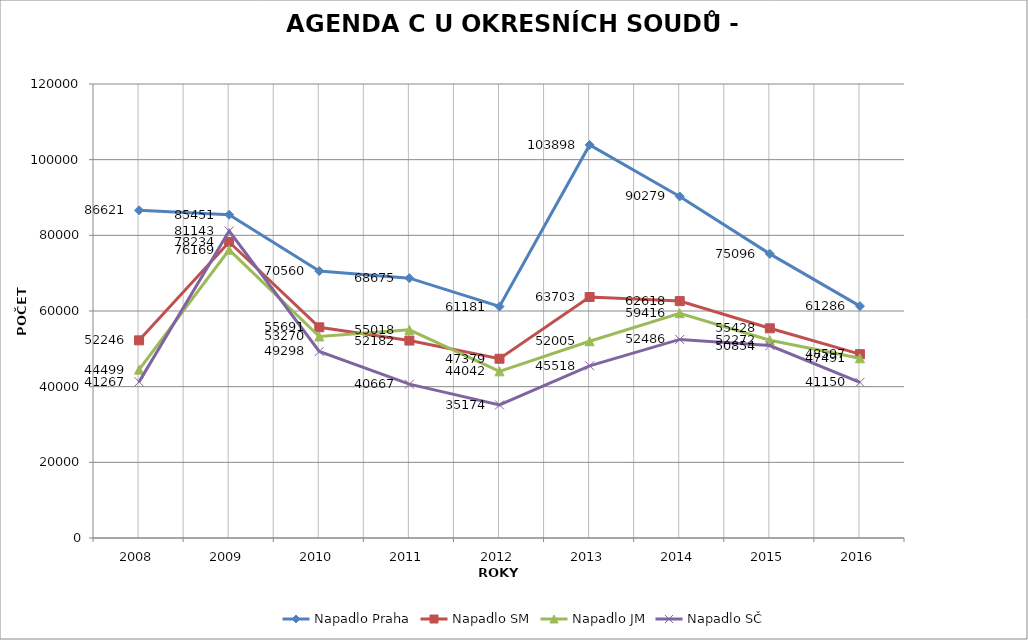
| Category | Napadlo Praha | Napadlo SM | Napadlo JM | Napadlo SČ |
|---|---|---|---|---|
| 2008.0 | 86621 | 52246 | 44499 | 41267 |
| 2009.0 | 85451 | 78234 | 76169 | 81143 |
| 2010.0 | 70560 | 55691 | 53270 | 49298 |
| 2011.0 | 68675 | 52182 | 55018 | 40667 |
| 2012.0 | 61181 | 47379 | 44042 | 35174 |
| 2013.0 | 103898 | 63703 | 52005 | 45518 |
| 2014.0 | 90279 | 62618 | 59416 | 52486 |
| 2015.0 | 75096 | 55428 | 52272 | 50854 |
| 2016.0 | 61286 | 48597 | 47491 | 41150 |